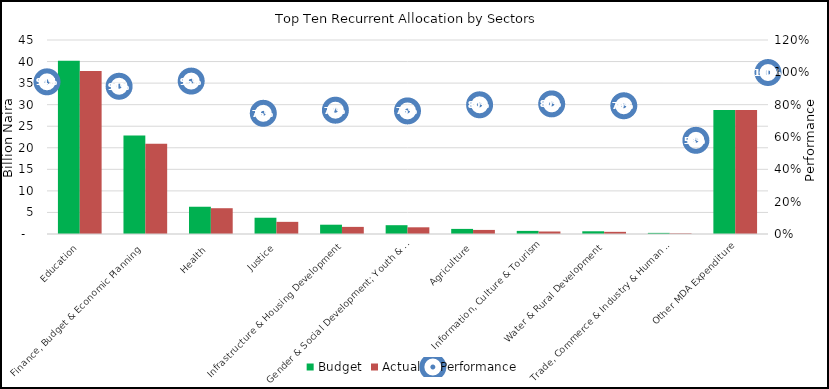
| Category | Budget | Actual |
|---|---|---|
| Education | 40161036524 | 37802132268.131 |
| Finance, Budget & Economic Planning  | 22876922600 | 20905656492.88 |
| Health  | 6322903214 | 5980786381.89 |
| Justice | 3773989230 | 2817539950.35 |
| Infrastructure & Housing Development | 2155342077 | 1650604128.41 |
| Gender & Social Development; Youth & Sports | 2041732897 | 1554476253.82 |
| Agriculture | 1182765688 | 945181954.72 |
| Information, Culture & Tourism | 720497686 | 579875091.06 |
| Water & Rural Development  | 630886638 | 500436047.97 |
| Trade, Commerce & Industry & Human Dev. | 259005355 | 150070198.08 |
| Other MDA Expenditure | 28780017722.46 | 28746329732.45 |